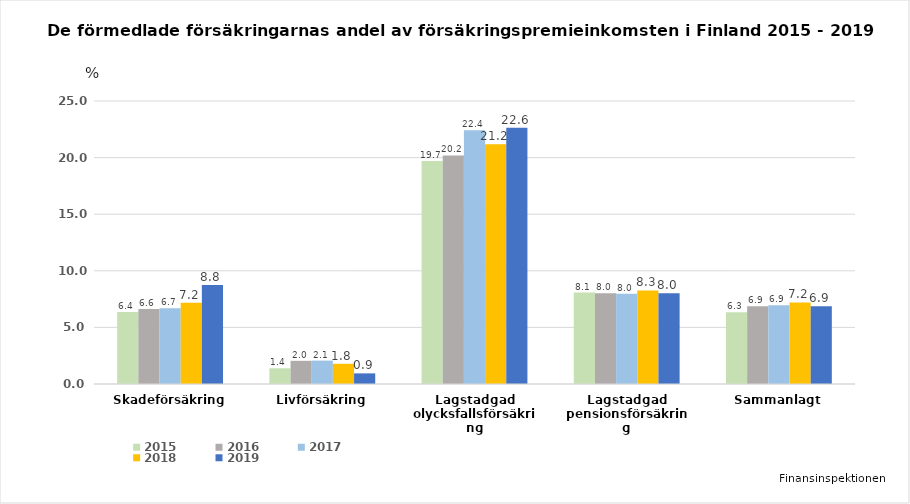
| Category | 2015 | 2016 | 2017 | 2018 | 2019 |
|---|---|---|---|---|---|
| Skadeförsäkring | 6.356 | 6.621 | 6.681 | 7.184 | 8.751 |
| Livförsäkring | 1.39 | 2.047 | 2.067 | 1.786 | 0.938 |
| Lagstadgad olycksfallsförsäkring | 19.692 | 20.194 | 22.408 | 21.186 | 22.632 |
| Lagstadgad pensionsförsäkring | 8.075 | 8.016 | 7.982 | 8.268 | 8.015 |
| Sammanlagt | 6.337 | 6.875 | 6.948 | 7.208 | 6.878 |